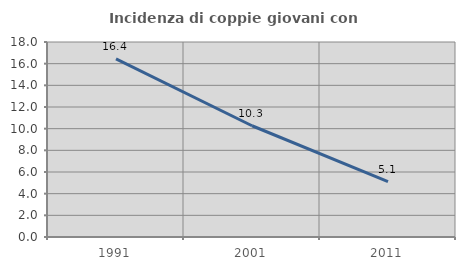
| Category | Incidenza di coppie giovani con figli |
|---|---|
| 1991.0 | 16.439 |
| 2001.0 | 10.27 |
| 2011.0 | 5.11 |